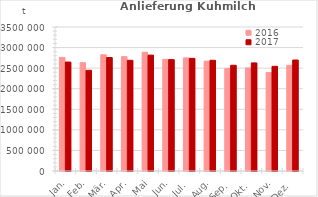
| Category | 2016 | 2017 |
|---|---|---|
| Jan. | 2761563.298 | 2648634.449 |
| Feb. | 2632664.697 | 2447649.626 |
| Mär. | 2824401.911 | 2758513.711 |
| Apr. | 2778899.022 | 2690911.28 |
| Mai | 2885636.73 | 2816615.94 |
| Jun. | 2715750.324 | 2706912.806 |
| Jul. | 2749414.847 | 2737987.212 |
| Aug. | 2670338.914 | 2691135.869 |
| Sep. | 2489267.983 | 2570309.688 |
| Okt. | 2504318.767 | 2627165.422 |
| Nov. | 2392039.563 | 2543908.901 |
| Dez. | 2568435.255 | 2697275.574 |